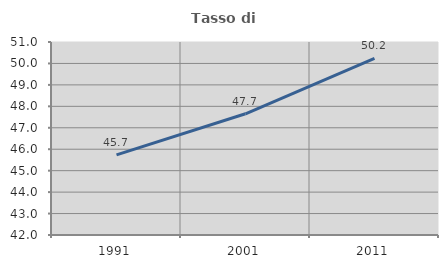
| Category | Tasso di occupazione   |
|---|---|
| 1991.0 | 45.734 |
| 2001.0 | 47.653 |
| 2011.0 | 50.241 |